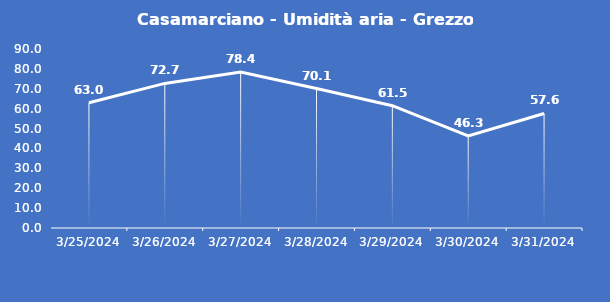
| Category | Casamarciano - Umidità aria - Grezzo (%) |
|---|---|
| 3/25/24 | 63 |
| 3/26/24 | 72.7 |
| 3/27/24 | 78.4 |
| 3/28/24 | 70.1 |
| 3/29/24 | 61.5 |
| 3/30/24 | 46.3 |
| 3/31/24 | 57.6 |